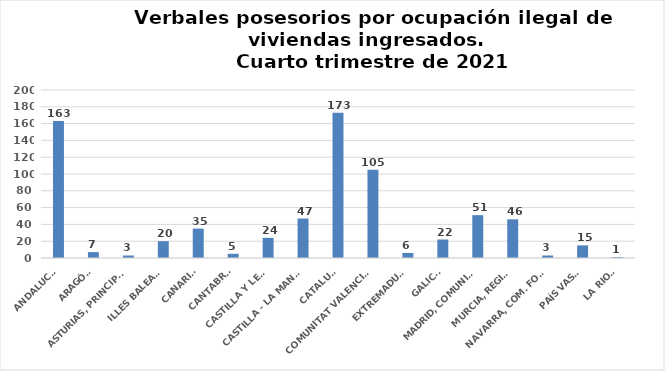
| Category | Series 0 |
|---|---|
| ANDALUCÍA | 163 |
| ARAGÓN | 7 |
| ASTURIAS, PRINCIPADO | 3 |
| ILLES BALEARS | 20 |
| CANARIAS | 35 |
| CANTABRIA | 5 |
| CASTILLA Y LEÓN | 24 |
| CASTILLA - LA MANCHA | 47 |
| CATALUÑA | 173 |
| COMUNITAT VALENCIANA | 105 |
| EXTREMADURA | 6 |
| GALICIA | 22 |
| MADRID, COMUNIDAD | 51 |
| MURCIA, REGIÓN | 46 |
| NAVARRA, COM. FORAL | 3 |
| PAÍS VASCO | 15 |
| LA RIOJA | 1 |